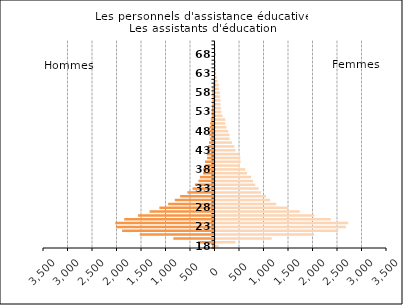
| Category | Femmes |
|---|---|
| 18.0 | 61 |
| 19.0 | 408 |
| 20.0 | 1146 |
| 21.0 | 2012 |
| 22.0 | 2506 |
| 23.0 | 2661 |
| 24.0 | 2708 |
| 25.0 | 2353 |
| 26.0 | 2015 |
| 27.0 | 1718 |
| 28.0 | 1480 |
| 29.0 | 1239 |
| 30.0 | 1115 |
| 31.0 | 1029 |
| 32.0 | 930 |
| 33.0 | 878 |
| 34.0 | 811 |
| 35.0 | 766 |
| 36.0 | 726 |
| 37.0 | 644 |
| 38.0 | 607 |
| 39.0 | 498 |
| 40.0 | 513 |
| 41.0 | 507 |
| 42.0 | 474 |
| 43.0 | 411 |
| 44.0 | 387 |
| 45.0 | 335 |
| 46.0 | 288 |
| 47.0 | 284 |
| 48.0 | 258 |
| 49.0 | 222 |
| 50.0 | 200 |
| 51.0 | 198 |
| 52.0 | 144 |
| 53.0 | 120 |
| 54.0 | 111 |
| 55.0 | 101 |
| 56.0 | 104 |
| 57.0 | 91 |
| 58.0 | 89 |
| 59.0 | 71 |
| 60.0 | 68 |
| 61.0 | 43 |
| 62.0 | 26 |
| 63.0 | 15 |
| 64.0 | 9 |
| 65.0 | 5 |
| 66.0 | 3 |
| 67.0 | 1 |
| 68.0 | 1 |
| 69.0 | 1 |
| 70.0 | 1 |
| 75.0 | 0 |